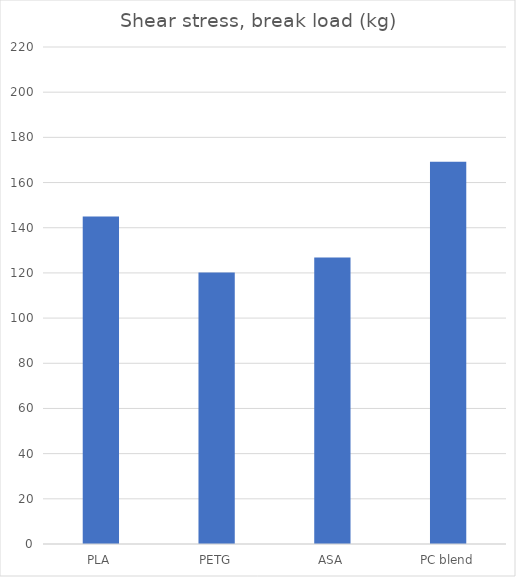
| Category | Break kg |
|---|---|
| PLA | 145 |
| PETG | 120.2 |
| ASA | 126.8 |
| PC blend | 169.2 |